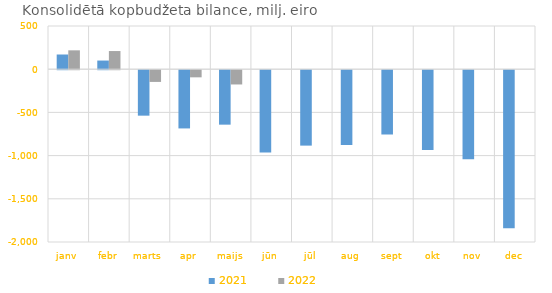
| Category | 2021 | 2022 |
|---|---|---|
| janv | 170157.398 | 218389.091 |
| febr | 100119.496 | 210185.141 |
| marts | -526188.27 | -135684.596 |
| apr | -673998.575 | -82545.759 |
| maijs | -630296.539 | -165099.527 |
| jūn | -953547.976 | 0 |
| jūl | -872897.27 | 0 |
| aug | -864679.341 | 0 |
| sept | -744219.279 | 0 |
| okt | -924686.722 | 0 |
| nov | -1031801.177 | 0 |
| dec | -1828320.005 | 0 |